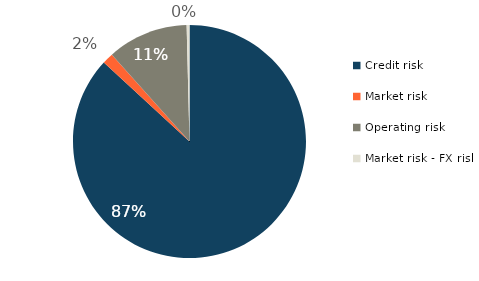
| Category | Series 0 |
|---|---|
| Credit risk | 0.869 |
| Market risk | 0.015 |
| Operating risk | 0.112 |
| Market risk - FX risk | 0.004 |